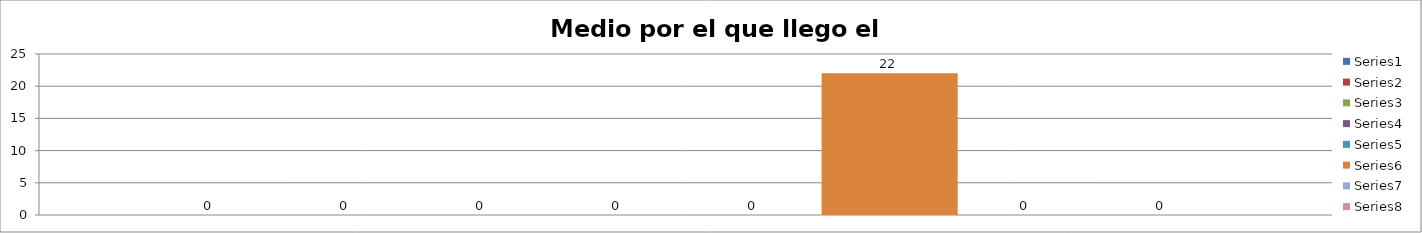
| Category | Series 0 | Series 1 | Series 2 | Series 3 | Series 4 | Series 5 | Series 6 | Series 7 |
|---|---|---|---|---|---|---|---|---|
| 0 | 0 | 0 | 0 | 0 | 0 | 22 | 0 | 0 |